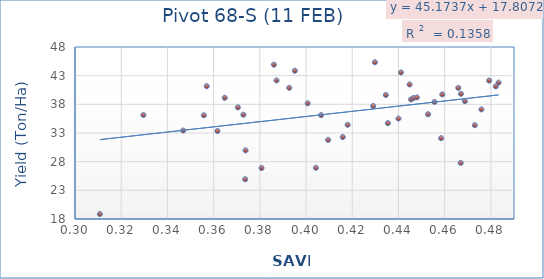
| Category | Series 0 |
|---|---|
| 0.467044 | 39.83 |
| 0.441078 | 43.563 |
| 0.468754 | 38.557 |
| 0.466941 | 27.79 |
| 0.482112 | 41.133 |
| 0.445457 | 38.86 |
| 0.475902 | 37.12 |
| 0.458946 | 39.733 |
| 0.446418 | 39.09 |
| 0.43542 | 34.72 |
| 0.429794 | 45.34 |
| 0.387226 | 42.167 |
| 0.400703 | 38.18 |
| 0.329603 | 36.147 |
| 0.373832 | 29.967 |
| 0.373664 | 24.933 |
| 0.310756 | 18.867 |
| 0.356999 | 41.167 |
| 0.473041 | 34.367 |
| 0.395158 | 43.853 |
| 0.346821 | 33.437 |
| 0.465886 | 40.877 |
| 0.452817 | 36.27 |
| 0.439995 | 35.523 |
| 0.483321 | 41.79 |
| 0.479247 | 42.147 |
| 0.434547 | 39.63 |
| 0.415899 | 32.297 |
| 0.444814 | 41.467 |
| 0.455581 | 38.41 |
| 0.406509 | 36.117 |
| 0.404255 | 26.927 |
| 0.429057 | 37.697 |
| 0.380734 | 26.893 |
| 0.355782 | 36.093 |
| 0.39273 | 40.88 |
| 0.370486 | 37.467 |
| 0.386082 | 44.913 |
| 0.361653 | 33.35 |
| 0.447982 | 39.217 |
| 0.409561 | 31.79 |
| 0.364822 | 39.14 |
| 0.41799 | 34.44 |
| 0.37287 | 36.193 |
| 0.458449 | 32.093 |